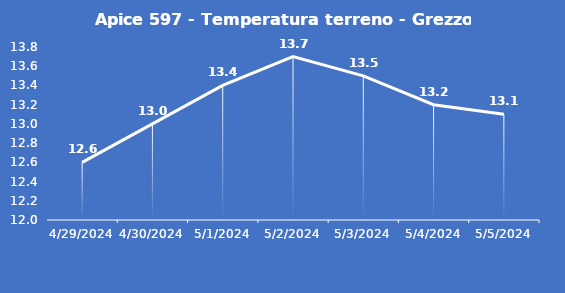
| Category | Apice 597 - Temperatura terreno - Grezzo (°C) |
|---|---|
| 4/29/24 | 12.6 |
| 4/30/24 | 13 |
| 5/1/24 | 13.4 |
| 5/2/24 | 13.7 |
| 5/3/24 | 13.5 |
| 5/4/24 | 13.2 |
| 5/5/24 | 13.1 |